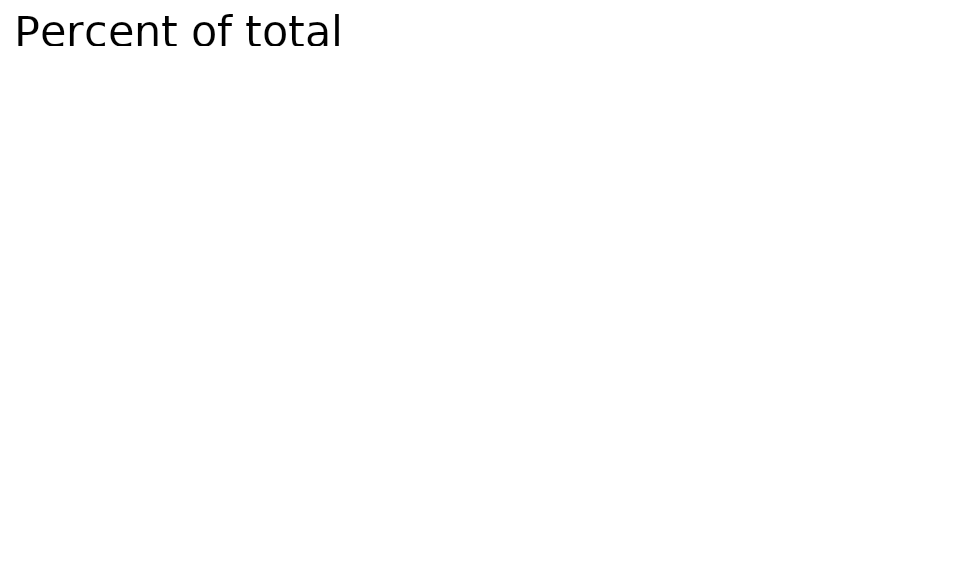
| Category | Exposure |
|---|---|
| Fertilizer imports | 25 |
| Tourist
arrivals | 13.4 |
| Imports | 9.9 |
| Food
imports | 8.5 |
| Exports to RUS and UKR | 5.3 |
| Calories from wheat imports | 4.3 |